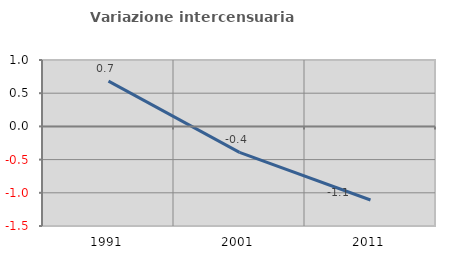
| Category | Variazione intercensuaria annua |
|---|---|
| 1991.0 | 0.682 |
| 2001.0 | -0.391 |
| 2011.0 | -1.108 |